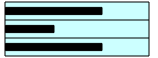
| Category | Series 0 |
|---|---|
| 0 | 0.667 |
| 1 | 0.333 |
| 2 | 0.667 |